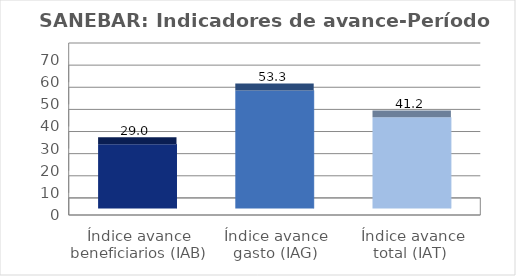
| Category | Series 0 |
|---|---|
| Índice avance beneficiarios (IAB)  | 29.032 |
| Índice avance gasto (IAG) | 53.333 |
| Índice avance total (IAT)  | 41.183 |